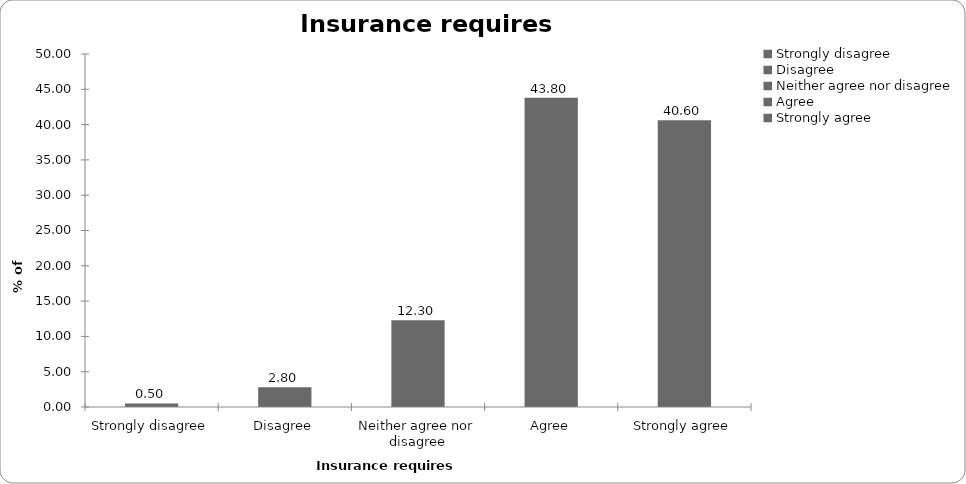
| Category | Insurance requires regulation |
|---|---|
| Strongly disagree | 0.5 |
| Disagree | 2.8 |
| Neither agree nor disagree | 12.3 |
| Agree | 43.8 |
| Strongly agree | 40.6 |